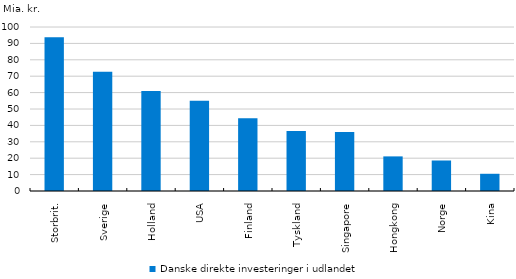
| Category | Danske direkte investeringer i udlandet |
|---|---|
| Storbrit. | 93.8 |
| Sverige | 72.7 |
| Holland | 61 |
| USA | 55.1 |
| Finland | 44.3 |
| Tyskland | 36.6 |
| Singapore | 35.9 |
| Hongkong | 21.1 |
| Norge | 18.6 |
| Kina | 10.5 |